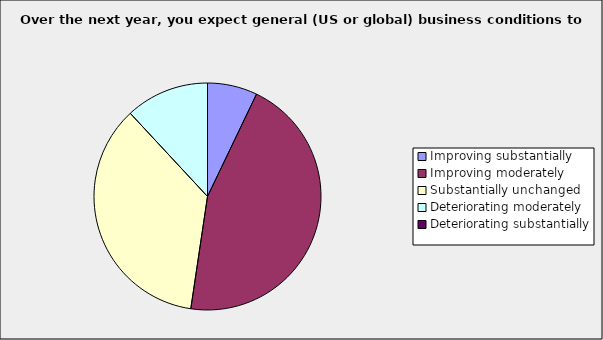
| Category | Series 0 |
|---|---|
| Improving substantially | 0.071 |
| Improving moderately | 0.452 |
| Substantially unchanged | 0.357 |
| Deteriorating moderately | 0.119 |
| Deteriorating substantially | 0 |